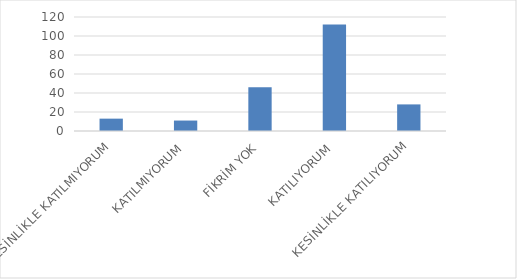
| Category | Series 0 |
|---|---|
| KESİNLİKLE KATILMIYORUM | 13 |
| KATILMIYORUM | 11 |
| FİKRİM YOK | 46 |
| KATILIYORUM | 112 |
| KESİNLİKLE KATILIYORUM | 28 |